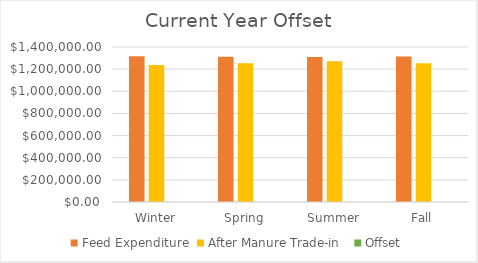
| Category | Feed Expenditure | After Manure Trade-in  | Offset |
|---|---|---|---|
| Winter | 1316798.52 | 1236798.52 | 0.065 |
| Spring | 1313046.03 | 1253046.03 | 0.048 |
| Summer | 1310245.52 | 1270245.52 | 0.031 |
| Fall | 1313544.75 | 1253544.75 | 0.048 |